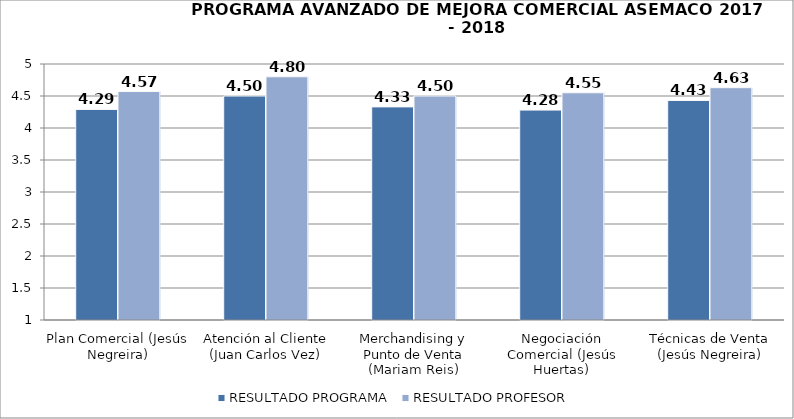
| Category | RESULTADO PROGRAMA | RESULTADO PROFESOR |
|---|---|---|
| Plan Comercial (Jesús Negreira) | 4.29 | 4.57 |
| Atención al Cliente (Juan Carlos Vez) | 4.5 | 4.8 |
| Merchandising y Punto de Venta (Mariam Reis) | 4.33 | 4.5 |
| Negociación Comercial (Jesús Huertas) | 4.28 | 4.55 |
| Técnicas de Venta (Jesús Negreira) | 4.43 | 4.63 |